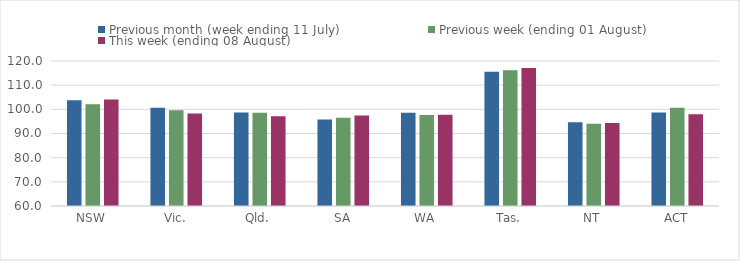
| Category | Previous month (week ending 11 July) | Previous week (ending 01 August) | This week (ending 08 August) |
|---|---|---|---|
| NSW | 103.744 | 102.112 | 104.092 |
| Vic. | 100.665 | 99.668 | 98.257 |
| Qld. | 98.681 | 98.634 | 97.163 |
| SA | 95.763 | 96.565 | 97.397 |
| WA | 98.547 | 97.674 | 97.747 |
| Tas. | 115.51 | 116.209 | 117.06 |
| NT | 94.693 | 94.084 | 94.369 |
| ACT | 98.675 | 100.662 | 97.947 |